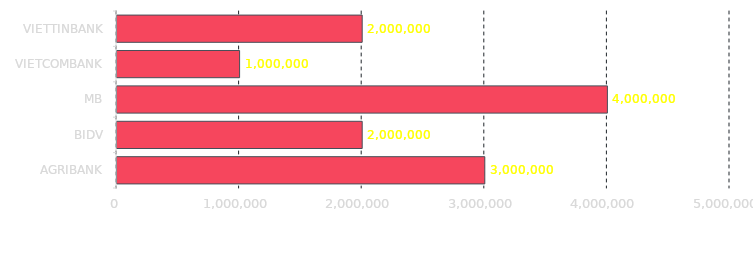
| Category | Series 0 |
|---|---|
| AGRIBANK | 3000000 |
| BIDV | 2000000 |
| MB | 4000000 |
| VIETCOMBANK | 1000000 |
| VIETTINBANK | 2000000 |